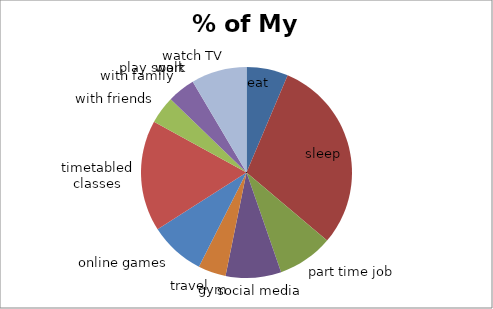
| Category | % of My Day |
|---|---|
| eat | 0.062 |
| sleep | 0.292 |
| part time job | 0.083 |
| social media | 0.083 |
| gym | 0 |
| travel | 0.042 |
| online games | 0.083 |
| timetabled classes | 0.167 |
| with friends | 0.042 |
| with family | 0.042 |
| play sport | 0 |
| walk | 0 |
| watch TV | 0.083 |